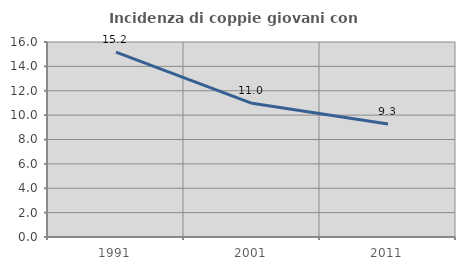
| Category | Incidenza di coppie giovani con figli |
|---|---|
| 1991.0 | 15.176 |
| 2001.0 | 10.97 |
| 2011.0 | 9.271 |